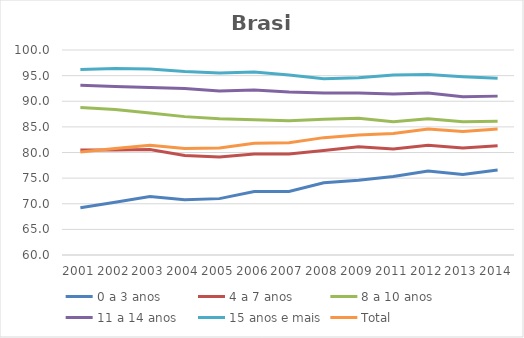
| Category | 0 a 3 anos | 4 a 7 anos | 8 a 10 anos | 11 a 14 anos | 15 anos e mais | Total |
|---|---|---|---|---|---|---|
| 2001.0 | 69.2 | 80.5 | 88.8 | 93.1 | 96.2 | 80.1 |
| 2002.0 | 70.3 | 80.5 | 88.4 | 92.9 | 96.4 | 80.8 |
| 2003.0 | 71.4 | 80.6 | 87.7 | 92.7 | 96.3 | 81.4 |
| 2004.0 | 70.8 | 79.4 | 87 | 92.5 | 95.8 | 80.8 |
| 2005.0 | 71 | 79.1 | 86.6 | 92 | 95.5 | 80.9 |
| 2006.0 | 72.4 | 79.7 | 86.4 | 92.2 | 95.7 | 81.8 |
| 2007.0 | 72.4 | 79.7 | 86.2 | 91.8 | 95.1 | 81.9 |
| 2008.0 | 74.1 | 80.4 | 86.5 | 91.6 | 94.4 | 82.9 |
| 2009.0 | 74.6 | 81.1 | 86.7 | 91.6 | 94.6 | 83.4 |
| 2011.0 | 75.3 | 80.7 | 86 | 91.4 | 95.1 | 83.7 |
| 2012.0 | 76.4 | 81.4 | 86.6 | 91.6 | 95.2 | 84.6 |
| 2013.0 | 75.7 | 80.9 | 86 | 90.9 | 94.8 | 84.1 |
| 2014.0 | 76.6 | 81.3 | 86.1 | 91 | 94.5 | 84.6 |